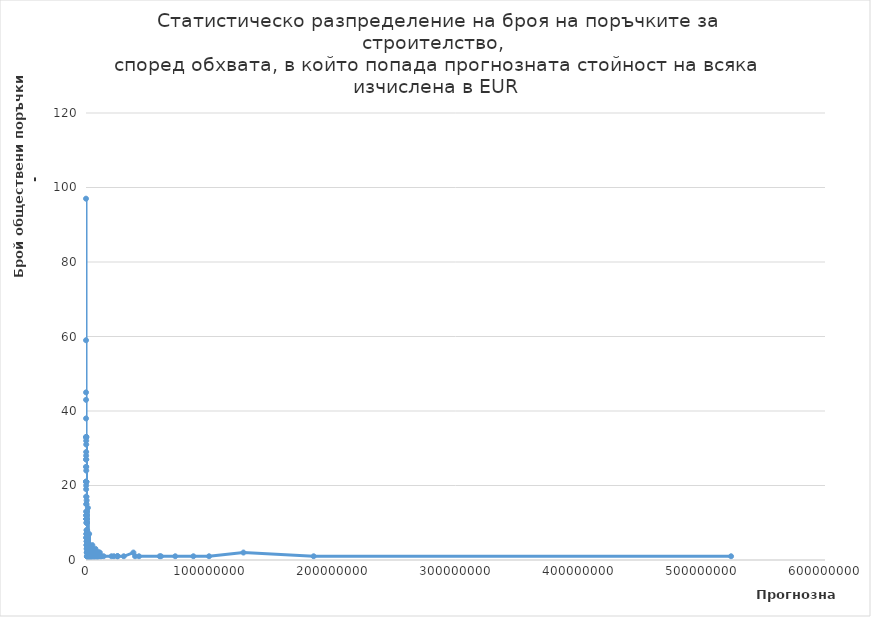
| Category | Series 0 |
|---|---|
| 10000.0 | 97 |
| 20000.0 | 59 |
| 30000.0 | 45 |
| 40000.0 | 43 |
| 50000.0 | 38 |
| 60000.0 | 33 |
| 70000.0 | 25 |
| 80000.0 | 21 |
| 90000.0 | 27 |
| 100000.0 | 19 |
| 110000.0 | 28 |
| 120000.0 | 21 |
| 130000.0 | 33 |
| 140000.0 | 20 |
| 150000.0 | 29 |
| 160000.0 | 32 |
| 170000.0 | 27 |
| 180000.0 | 31 |
| 190000.0 | 33 |
| 200000.0 | 25 |
| 210000.0 | 21 |
| 220000.0 | 24 |
| 230000.0 | 21 |
| 240000.0 | 21 |
| 250000.0 | 17 |
| 260000.0 | 33 |
| 270000.0 | 15 |
| 280000.0 | 12 |
| 290000.0 | 12 |
| 300000.0 | 7 |
| 310000.0 | 17 |
| 320000.0 | 15 |
| 330000.0 | 10 |
| 340000.0 | 13 |
| 350000.0 | 6 |
| 360000.0 | 11 |
| 370000.0 | 13 |
| 380000.0 | 6 |
| 390000.0 | 12 |
| 400000.0 | 11 |
| 410000.0 | 11 |
| 420000.0 | 4 |
| 430000.0 | 11 |
| 440000.0 | 11 |
| 450000.0 | 13 |
| 460000.0 | 6 |
| 470000.0 | 11 |
| 480000.0 | 8 |
| 490000.0 | 11 |
| 500000.0 | 7 |
| 510000.0 | 12 |
| 520000.0 | 16 |
| 530000.0 | 11 |
| 540000.0 | 6 |
| 550000.0 | 5 |
| 560000.0 | 6 |
| 570000.0 | 10 |
| 580000.0 | 4 |
| 590000.0 | 3 |
| 600000.0 | 8 |
| 610000.0 | 2 |
| 620000.0 | 10 |
| 630000.0 | 7 |
| 640000.0 | 7 |
| 650000.0 | 3 |
| 660000.0 | 4 |
| 670000.0 | 5 |
| 680000.0 | 1 |
| 690000.0 | 5 |
| 710000.0 | 4 |
| 720000.0 | 5 |
| 730000.0 | 2 |
| 750000.0 | 6 |
| 760000.0 | 4 |
| 770000.0 | 10 |
| 780000.0 | 2 |
| 790000.0 | 4 |
| 800000.0 | 5 |
| 810000.0 | 3 |
| 820000.0 | 5 |
| 830000.0 | 3 |
| 840000.0 | 4 |
| 850000.0 | 2 |
| 860000.0 | 7 |
| 870000.0 | 3 |
| 880000.0 | 2 |
| 890000.0 | 4 |
| 900000.0 | 1 |
| 910000.0 | 3 |
| 930000.0 | 2 |
| 940000.0 | 8 |
| 950000.0 | 1 |
| 960000.0 | 5 |
| 970000.0 | 4 |
| 980000.0 | 2 |
| 990000.0 | 1 |
| 1000000.0 | 3 |
| 1010000.0 | 3 |
| 1030000.0 | 5 |
| 1040000.0 | 2 |
| 1050000.0 | 1 |
| 1060000.0 | 1 |
| 1070000.0 | 4 |
| 1080000.0 | 4 |
| 1090000.0 | 6 |
| 1110000.0 | 1 |
| 1120000.0 | 1 |
| 1130000.0 | 3 |
| 1140000.0 | 4 |
| 1150000.0 | 1 |
| 1160000.0 | 2 |
| 1170000.0 | 1 |
| 1180000.0 | 2 |
| 1190000.0 | 2 |
| 1200000.0 | 2 |
| 1210000.0 | 4 |
| 1220000.0 | 2 |
| 1230000.0 | 2 |
| 1240000.0 | 1 |
| 1250000.0 | 2 |
| 1260000.0 | 2 |
| 1270000.0 | 5 |
| 1280000.0 | 7 |
| 1290000.0 | 1 |
| 1300000.0 | 1 |
| 1310000.0 | 4 |
| 1340000.0 | 3 |
| 1350000.0 | 1 |
| 1390000.0 | 3 |
| 1400000.0 | 2 |
| 1410000.0 | 2 |
| 1420000.0 | 1 |
| 1430000.0 | 2 |
| 1440000.0 | 2 |
| 1460000.0 | 1 |
| 1470000.0 | 3 |
| 1490000.0 | 3 |
| 1500000.0 | 1 |
| 1510000.0 | 1 |
| 1540000.0 | 14 |
| 1550000.0 | 1 |
| 1570000.0 | 1 |
| 1590000.0 | 2 |
| 1600000.0 | 2 |
| 1620000.0 | 1 |
| 1630000.0 | 3 |
| 1650000.0 | 2 |
| 1700000.0 | 3 |
| 1710000.0 | 2 |
| 1730000.0 | 1 |
| 1740000.0 | 1 |
| 1750000.0 | 1 |
| 1780000.0 | 1 |
| 1790000.0 | 1 |
| 1800000.0 | 1 |
| 1810000.0 | 1 |
| 1820000.0 | 1 |
| 1850000.0 | 2 |
| 1880000.0 | 1 |
| 1890000.0 | 1 |
| 1900000.0 | 2 |
| 1910000.0 | 2 |
| 1920000.0 | 2 |
| 1930000.0 | 1 |
| 1940000.0 | 2 |
| 1950000.0 | 1 |
| 1970000.0 | 1 |
| 1990000.0 | 1 |
| 2030000.0 | 1 |
| 2040000.0 | 1 |
| 2050000.0 | 3 |
| 2060000.0 | 1 |
| 2070000.0 | 2 |
| 2080000.0 | 2 |
| 2090000.0 | 1 |
| 2100000.0 | 1 |
| 2110000.0 | 1 |
| 2130000.0 | 1 |
| 2190000.0 | 1 |
| 2210000.0 | 1 |
| 2250000.0 | 2 |
| 2260000.0 | 1 |
| 2280000.0 | 1 |
| 2300000.0 | 2 |
| 2310000.0 | 1 |
| 2320000.0 | 2 |
| 2330000.0 | 2 |
| 2340000.0 | 1 |
| 2360000.0 | 1 |
| 2370000.0 | 1 |
| 2380000.0 | 1 |
| 2390000.0 | 2 |
| 2410000.0 | 1 |
| 2420000.0 | 1 |
| 2430000.0 | 1 |
| 2450000.0 | 1 |
| 2470000.0 | 2 |
| 2500000.0 | 2 |
| 2510000.0 | 1 |
| 2540000.0 | 3 |
| 2560000.0 | 7 |
| 2590000.0 | 2 |
| 2600000.0 | 1 |
| 2670000.0 | 1 |
| 2710000.0 | 1 |
| 2790000.0 | 1 |
| 2830000.0 | 1 |
| 2850000.0 | 1 |
| 2900000.0 | 1 |
| 2910000.0 | 3 |
| 2920000.0 | 1 |
| 2960000.0 | 1 |
| 2990000.0 | 1 |
| 3020000.0 | 3 |
| 3070000.0 | 4 |
| 3080000.0 | 2 |
| 3140000.0 | 2 |
| 3150000.0 | 1 |
| 3170000.0 | 1 |
| 3180000.0 | 1 |
| 3220000.0 | 2 |
| 3240000.0 | 1 |
| 3250000.0 | 1 |
| 3280000.0 | 1 |
| 3290000.0 | 1 |
| 3330000.0 | 2 |
| 3390000.0 | 2 |
| 3400000.0 | 1 |
| 3520000.0 | 1 |
| 3530000.0 | 1 |
| 3580000.0 | 2 |
| 3640000.0 | 1 |
| 3690000.0 | 2 |
| 3740000.0 | 1 |
| 3840000.0 | 1 |
| 3900000.0 | 1 |
| 3960000.0 | 1 |
| 3980000.0 | 1 |
| 4100000.0 | 2 |
| 4220000.0 | 1 |
| 4230000.0 | 1 |
| 4270000.0 | 1 |
| 4320000.0 | 1 |
| 4370000.0 | 1 |
| 4390000.0 | 1 |
| 4610000.0 | 1 |
| 4660000.0 | 2 |
| 4680000.0 | 1 |
| 4820000.0 | 1 |
| 4850000.0 | 1 |
| 5120000.0 | 4 |
| 5250000.0 | 1 |
| 5370000.0 | 1 |
| 5790000.0 | 1 |
| 5990000.0 | 1 |
| 6240000.0 | 1 |
| 6620000.0 | 1 |
| 6650000.0 | 1 |
| 6660000.0 | 1 |
| 6760000.0 | 1 |
| 6910000.0 | 1 |
| 6960000.0 | 2 |
| 7300000.0 | 1 |
| 7550000.0 | 2 |
| 7560000.0 | 1 |
| 7590000.0 | 1 |
| 7670000.0 | 3 |
| 8160000.0 | 1 |
| 8200000.0 | 1 |
| 8670000.0 | 1 |
| 8910000.0 | 1 |
| 9120000.0 | 1 |
| 9170000.0 | 2 |
| 9210000.0 | 2 |
| 9240000.0 | 1 |
| 9320000.0 | 1 |
| 9370000.0 | 1 |
| 9720000.0 | 1 |
| 9790000.0 | 1 |
| 9830000.0 | 2 |
| 10230000.0 | 1 |
| 10280000.0 | 2 |
| 10310000.0 | 2 |
| 10340000.0 | 1 |
| 11220000.0 | 2 |
| 11400000.0 | 1 |
| 12170000.0 | 1 |
| 12390000.0 | 1 |
| 14310000.0 | 1 |
| 20680000.0 | 1 |
| 22690000.0 | 1 |
| 25570000.0 | 1 |
| 25630000.0 | 1 |
| 25640000.0 | 1 |
| 30680000.0 | 1 |
| 38490000.0 | 2 |
| 39840000.0 | 1 |
| 43030000.0 | 1 |
| 59830000.0 | 1 |
| 60850000.0 | 1 |
| 72440000.0 | 1 |
| 87180000.0 | 1 |
| 99920000.0 | 1 |
| 127830000.0 | 2 |
| 184830000.0 | 1 |
| 523740000.0 | 1 |